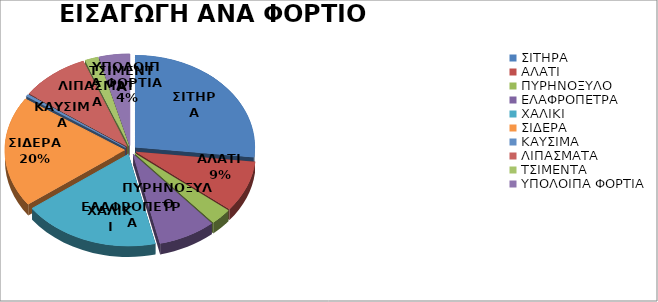
| Category | Series 0 |
|---|---|
| ΣΙΤΗΡΑ | 30028.23 |
| ΑΛΑΤΙ | 10094.95 |
| ΠΥΡΗΝΟΞΥΛΟ | 3238.39 |
| ΕΛΑΦΡΟΠΕΤΡΑ | 8736 |
| ΧΑΛΙΚΙ | 20795.53 |
| ΣΙΔΕΡΑ | 21910.53 |
| ΚΑΥΣΙΜΑ | 408.965 |
| ΛΙΠΑΣΜΑΤΑ | 10403.99 |
| ΤΣΙΜΕΝΤΑ | 2000 |
| ΥΠΟΛΟΙΠΑ ΦΟΡΤΙΑ | 4688.305 |